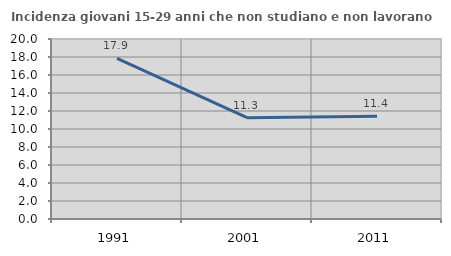
| Category | Incidenza giovani 15-29 anni che non studiano e non lavorano  |
|---|---|
| 1991.0 | 17.857 |
| 2001.0 | 11.263 |
| 2011.0 | 11.407 |